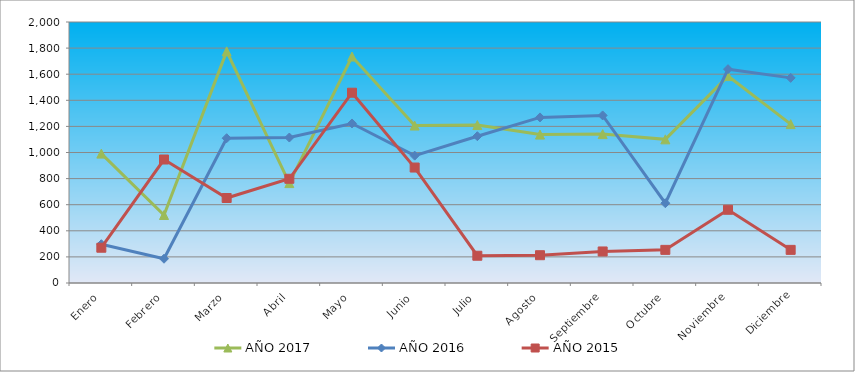
| Category | AÑO 2017 | AÑO 2016 | AÑO 2015 |
|---|---|---|---|
| Enero | 991.451 | 297.341 | 270.329 |
| Febrero | 521.241 | 185.838 | 946.152 |
| Marzo | 1775.135 | 1109.477 | 651.248 |
| Abril | 765.459 | 1114.613 | 798.7 |
| Mayo | 1735.04 | 1222.479 | 1458.14 |
| Junio | 1206.509 | 975.929 | 884.714 |
| Julio | 1210.154 | 1124.886 | 208.891 |
| Agosto | 1137.253 | 1268.707 | 212.987 |
| Septiembre | 1140.898 | 1284.117 | 241.658 |
| Octubre | 1100.803 | 611.24 | 253.946 |
| Noviembre | 1585.593 | 1638.533 | 561.138 |
| Diciembre | 1217.444 | 1571.759 | 253.946 |